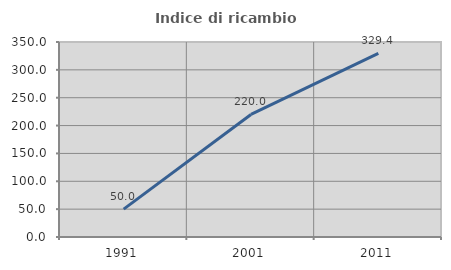
| Category | Indice di ricambio occupazionale  |
|---|---|
| 1991.0 | 50 |
| 2001.0 | 220 |
| 2011.0 | 329.412 |